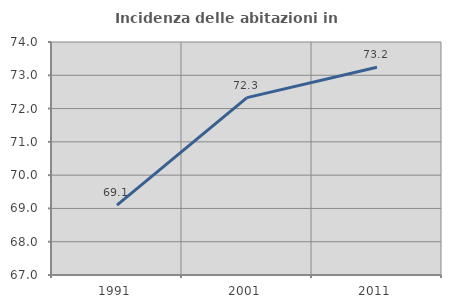
| Category | Incidenza delle abitazioni in proprietà  |
|---|---|
| 1991.0 | 69.098 |
| 2001.0 | 72.328 |
| 2011.0 | 73.242 |